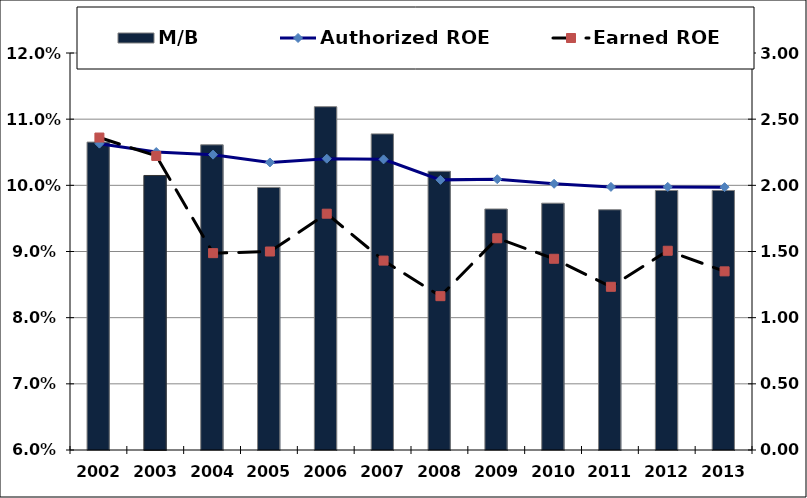
| Category | M/B |
|---|---|
| 2002.0 | 2.327 |
| 2003.0 | 2.074 |
| 2004.0 | 2.306 |
| 2005.0 | 1.984 |
| 2006.0 | 2.594 |
| 2007.0 | 2.389 |
| 2008.0 | 2.106 |
| 2009.0 | 1.821 |
| 2010.0 | 1.865 |
| 2011.0 | 1.816 |
| 2012.0 | 1.961 |
| 2013.0 | 1.961 |